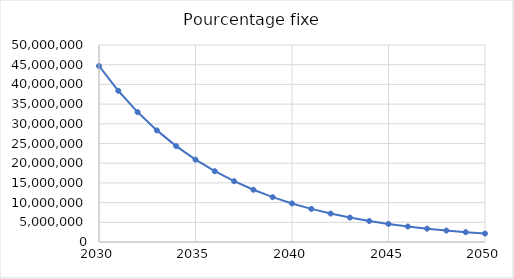
| Category | Pourcentage fixe |
|---|---|
| 2030.0 | 44677380 |
| 2031.0 | 38382423.592 |
| 2032.0 | 32974414.364 |
| 2033.0 | 28328383.173 |
| 2034.0 | 24336968.789 |
| 2035.0 | 20907936.97 |
| 2036.0 | 17962049.1 |
| 2037.0 | 15431231.132 |
| 2038.0 | 13257000.519 |
| 2039.0 | 11389114.793 |
| 2040.0 | 9784410.553 |
| 2041.0 | 8405806.035 |
| 2042.0 | 7221444.227 |
| 2043.0 | 6203956.706 |
| 2044.0 | 5329831.209 |
| 2045.0 | 4578868.303 |
| 2046.0 | 3933714.617 |
| 2047.0 | 3379461.838 |
| 2048.0 | 2903302.203 |
| 2049.0 | 2494232.539 |
| 2050.0 | 2142800 |